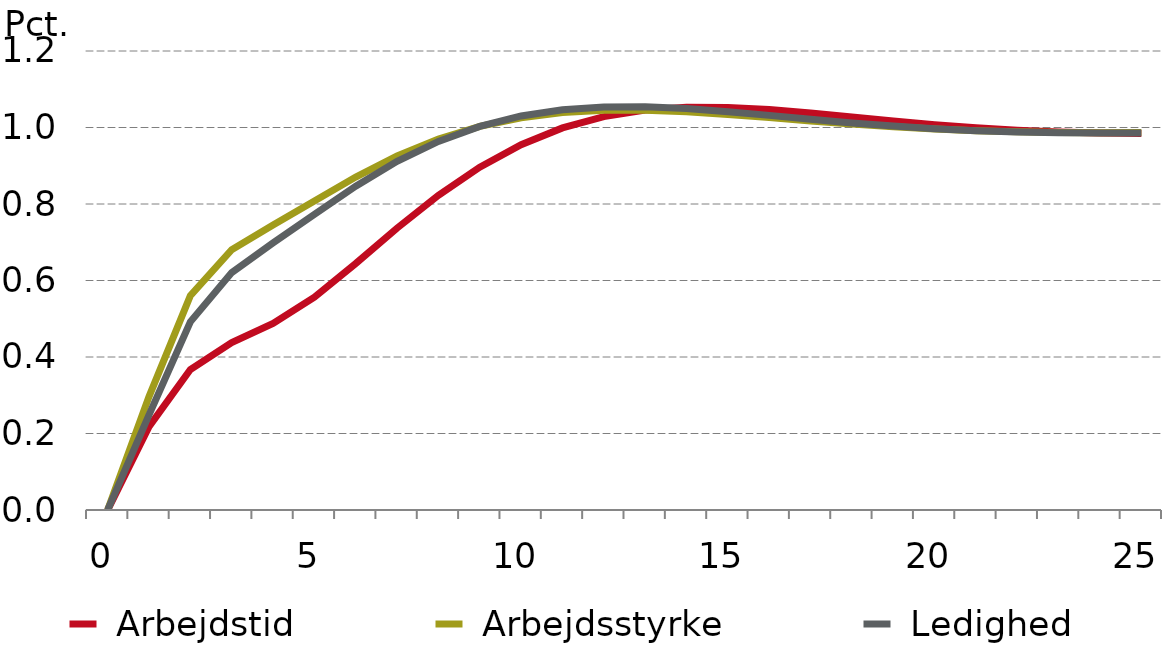
| Category |  Arbejdstid |  Arbejdsstyrke |  Ledighed |
|---|---|---|---|
| 0.0 | 0 | 0 | 0 |
| nan | 0.218 | 0.296 | 0.249 |
| nan | 0.367 | 0.561 | 0.492 |
| nan | 0.438 | 0.681 | 0.621 |
| nan | 0.488 | 0.745 | 0.698 |
| 5.0 | 0.556 | 0.808 | 0.773 |
| nan | 0.644 | 0.871 | 0.847 |
| nan | 0.737 | 0.926 | 0.911 |
| nan | 0.823 | 0.97 | 0.964 |
| nan | 0.896 | 1.003 | 1.003 |
| 10.0 | 0.955 | 1.026 | 1.03 |
| nan | 0.999 | 1.039 | 1.046 |
| nan | 1.029 | 1.045 | 1.054 |
| nan | 1.046 | 1.045 | 1.054 |
| nan | 1.053 | 1.041 | 1.049 |
| 15.0 | 1.053 | 1.034 | 1.041 |
| nan | 1.047 | 1.026 | 1.032 |
| nan | 1.038 | 1.017 | 1.022 |
| nan | 1.028 | 1.009 | 1.012 |
| nan | 1.017 | 1.002 | 1.004 |
| 20.0 | 1.007 | 0.996 | 0.997 |
| nan | 0.999 | 0.992 | 0.992 |
| nan | 0.993 | 0.989 | 0.988 |
| nan | 0.988 | 0.987 | 0.986 |
| nan | 0.986 | 0.986 | 0.985 |
| 25.0 | 0.984 | 0.987 | 0.986 |